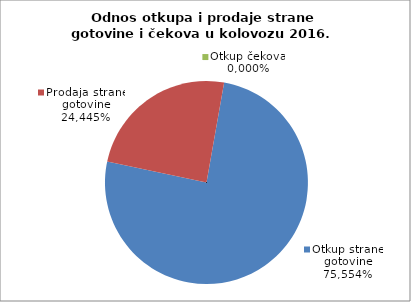
| Category | Otkup strane gotovine |
|---|---|
| 0 | 0.756 |
| 1 | 0.244 |
| 2 | 0 |